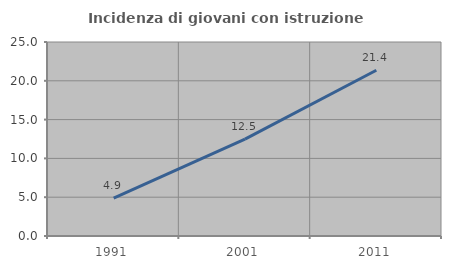
| Category | Incidenza di giovani con istruzione universitaria |
|---|---|
| 1991.0 | 4.884 |
| 2001.0 | 12.477 |
| 2011.0 | 21.357 |